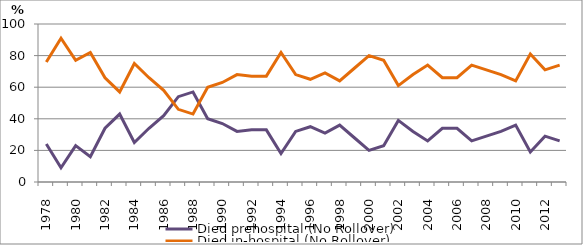
| Category | Died prehospital (No Rollover) | Died in-hospital (No Rollover) |
|---|---|---|
| 1978.0 | 24 | 76 |
| 1979.0 | 9 | 91 |
| 1980.0 | 23 | 77 |
| 1981.0 | 16 | 82 |
| 1982.0 | 34 | 66 |
| 1983.0 | 43 | 57 |
| 1984.0 | 25 | 75 |
| 1985.0 | 34 | 66 |
| 1986.0 | 42 | 58 |
| 1987.0 | 54 | 46 |
| 1988.0 | 57 | 43 |
| 1989.0 | 40 | 60 |
| 1990.0 | 37 | 63 |
| 1991.0 | 32 | 68 |
| 1992.0 | 33 | 67 |
| 1993.0 | 33 | 67 |
| 1994.0 | 18 | 82 |
| 1995.0 | 32 | 68 |
| 1996.0 | 35 | 65 |
| 1997.0 | 31 | 69 |
| 1998.0 | 36 | 64 |
| 1999.0 | 28 | 72 |
| 2000.0 | 20 | 80 |
| 2001.0 | 23 | 77 |
| 2002.0 | 39 | 61 |
| 2003.0 | 32 | 68 |
| 2004.0 | 26 | 74 |
| 2005.0 | 34 | 66 |
| 2006.0 | 34 | 66 |
| 2007.0 | 26 | 74 |
| 2008.0 | 29 | 71 |
| 2009.0 | 32 | 68 |
| 2010.0 | 36 | 64 |
| 2011.0 | 19 | 81 |
| 2012.0 | 29 | 71 |
| 2013.0 | 26 | 74 |